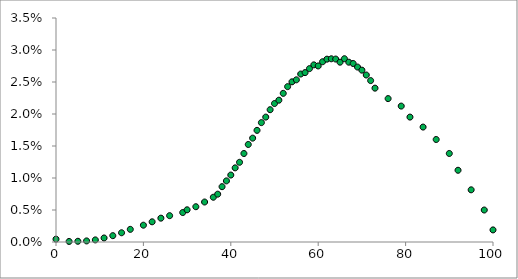
| Category | Series 0 |
|---|---|
| 0.0 | 0 |
| 3.0 | 0 |
| 5.0 | 0 |
| 7.0 | 0 |
| 9.0 | 0 |
| 11.0 | 0.001 |
| 13.0 | 0.001 |
| 15.0 | 0.001 |
| 17.0 | 0.002 |
| 20.0 | 0.003 |
| 22.0 | 0.003 |
| 24.0 | 0.004 |
| 26.0 | 0.004 |
| 29.0 | 0.005 |
| 30.0 | 0.005 |
| 32.0 | 0.006 |
| 34.0 | 0.006 |
| 36.0 | 0.007 |
| 37.0 | 0.007 |
| 38.0 | 0.009 |
| 39.0 | 0.01 |
| 40.0 | 0.01 |
| 41.0 | 0.012 |
| 42.0 | 0.012 |
| 43.0 | 0.014 |
| 44.0 | 0.015 |
| 45.0 | 0.016 |
| 46.0 | 0.017 |
| 47.0 | 0.019 |
| 48.0 | 0.02 |
| 49.0 | 0.021 |
| 50.0 | 0.022 |
| 51.0 | 0.022 |
| 52.0 | 0.023 |
| 53.0 | 0.024 |
| 54.0 | 0.025 |
| 55.0 | 0.025 |
| 56.0 | 0.026 |
| 57.0 | 0.026 |
| 58.0 | 0.027 |
| 59.0 | 0.028 |
| 60.0 | 0.028 |
| 61.0 | 0.028 |
| 62.0 | 0.029 |
| 63.0 | 0.029 |
| 64.0 | 0.029 |
| 65.0 | 0.028 |
| 66.0 | 0.029 |
| 67.0 | 0.028 |
| 68.0 | 0.028 |
| 69.0 | 0.027 |
| 70.0 | 0.027 |
| 71.0 | 0.026 |
| 72.0 | 0.025 |
| 73.0 | 0.024 |
| 76.0 | 0.022 |
| 79.0 | 0.021 |
| 81.0 | 0.02 |
| 84.0 | 0.018 |
| 87.0 | 0.016 |
| 90.0 | 0.014 |
| 92.0 | 0.011 |
| 95.0 | 0.008 |
| 98.0 | 0.005 |
| 100.0 | 0.002 |